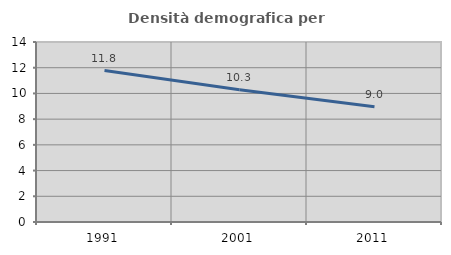
| Category | Densità demografica |
|---|---|
| 1991.0 | 11.776 |
| 2001.0 | 10.286 |
| 2011.0 | 8.957 |